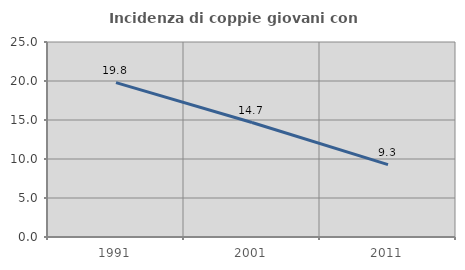
| Category | Incidenza di coppie giovani con figli |
|---|---|
| 1991.0 | 19.796 |
| 2001.0 | 14.678 |
| 2011.0 | 9.279 |